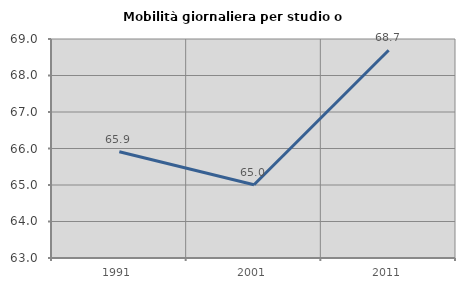
| Category | Mobilità giornaliera per studio o lavoro |
|---|---|
| 1991.0 | 65.91 |
| 2001.0 | 65.007 |
| 2011.0 | 68.693 |